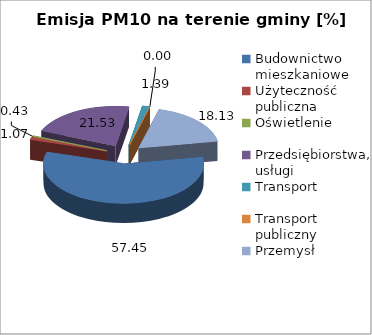
| Category | 57,45 1,07 0,43 21,53 1,39 0,00 18,13 |
|---|---|
| Budownictwo mieszkaniowe | 57.45 |
| Użyteczność publiczna | 1.071 |
| Oświetlenie | 0.435 |
| Przedsiębiorstwa, usługi | 21.525 |
| Transport | 1.39 |
| Transport publiczny | 0 |
| Przemysł | 18.129 |